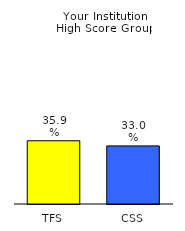
| Category | Series 0 |
|---|---|
| TFS | 0.359 |
| CSS | 0.33 |